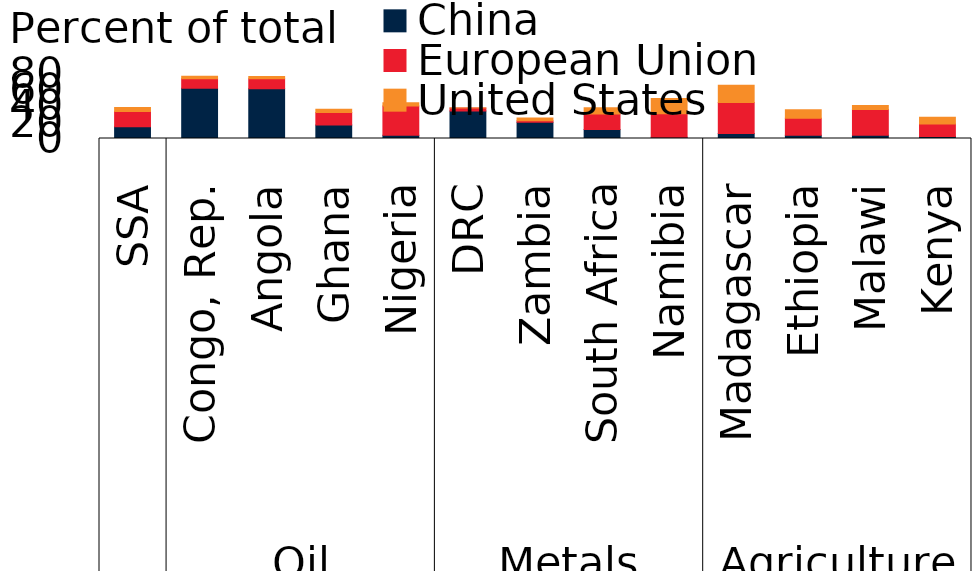
| Category | China | European Union | United States |
|---|---|---|---|
| 0 | 14.4 | 18.9 | 4.9 |
| 1 | 61.8 | 11.7 | 3.1 |
| 2 | 61.3 | 12.2 | 2.7 |
| 3 | 16.7 | 15.2 | 4.2 |
| 4 | 4.1 | 35.8 | 4.2 |
| 5 | 33.8 | 3.6 | 0.1 |
| 6 | 20 | 1.9 | 3.4 |
| 7 | 11.1 | 19 | 7.7 |
| 8 | 1.4 | 29 | 18.8 |
| 9 | 6.2 | 38.2 | 21.2 |
| 10 | 4.1 | 20.8 | 10.6 |
| 11 | 4.1 | 31.6 | 5 |
| 12 | 2.4 | 15.6 | 8.2 |